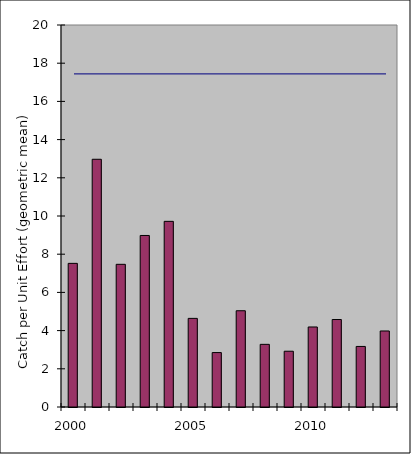
| Category | CPUE  |
|---|---|
| 2000.0 | 7.52 |
| 2001.0 | 12.97 |
| 2002.0 | 7.47 |
| 2003.0 | 8.98 |
| 2004.0 | 9.72 |
| 2005.0 | 4.64 |
| 2006.0 | 2.85 |
| 2007.0 | 5.04 |
| 2008.0 | 3.28 |
| 2009.0 | 2.92 |
| 2010.0 | 4.19 |
| 2011.0 | 4.58 |
| 2012.0 | 3.17 |
| 2013.0 | 3.98 |